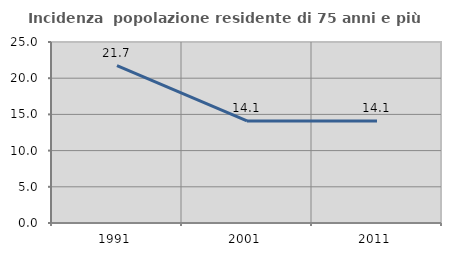
| Category | Incidenza  popolazione residente di 75 anni e più |
|---|---|
| 1991.0 | 21.739 |
| 2001.0 | 14.103 |
| 2011.0 | 14.103 |